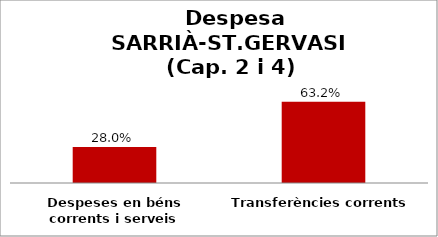
| Category | Series 0 |
|---|---|
| Despeses en béns corrents i serveis | 0.28 |
| Transferències corrents | 0.632 |